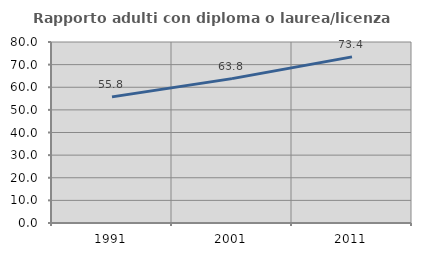
| Category | Rapporto adulti con diploma o laurea/licenza media  |
|---|---|
| 1991.0 | 55.752 |
| 2001.0 | 63.816 |
| 2011.0 | 73.418 |